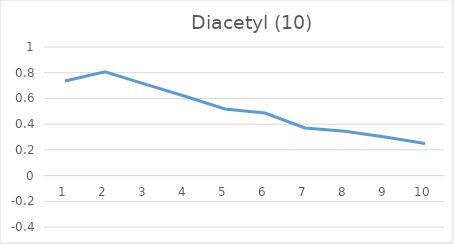
| Category | Series 0 |
|---|---|
| 0 | 0.736 |
| 1 | 0.806 |
| 2 | 0.711 |
| 3 | 0.617 |
| 4 | 0.518 |
| 5 | 0.486 |
| 6 | 0.37 |
| 7 | 0.345 |
| 8 | 0.3 |
| 9 | 0.249 |